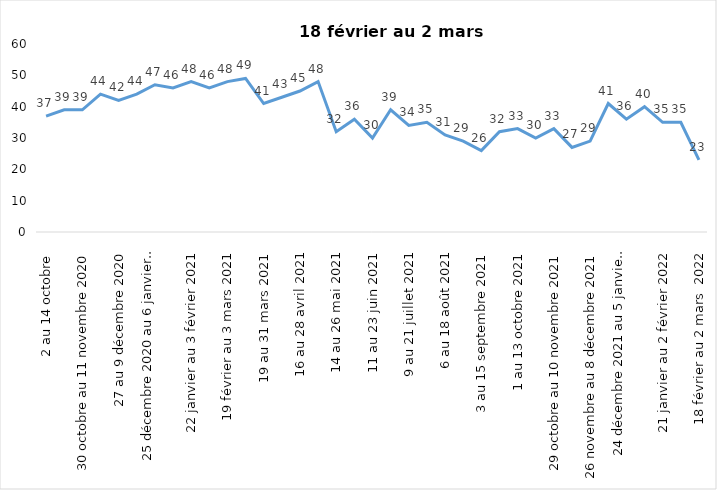
| Category | Toujours aux trois mesures |
|---|---|
| 2 au 14 octobre  | 37 |
| 16 au 28 octobre 2020 | 39 |
| 30 octobre au 11 novembre 2020 | 39 |
| 13 au 25 novembre 2020 | 44 |
| 27 au 9 décembre 2020 | 42 |
| 11 au 25 décembre 2020 | 44 |
| 25 décembre 2020 au 6 janvier  2021 | 47 |
| 8 au 20 janvier 2021 | 46 |
| 22 janvier au 3 février 2021 | 48 |
| 5 au 17 février 2021 | 46 |
| 19 février au 3 mars 2021 | 48 |
| 5 au 17 mars 2021 | 49 |
| 19 au 31 mars 2021 | 41 |
| 2 au 14 avril 2021 | 43 |
| 16 au 28 avril 2021 | 45 |
| 30 avril au 12 mai 2021 | 48 |
| 14 au 26 mai 2021 | 32 |
| 28 mai au 9 juin 2021 | 36 |
| 11 au 23 juin 2021 | 30 |
| 25 juin au 7 juillet 2021 | 39 |
| 9 au 21 juillet 2021 | 34 |
| 23 au 4 août 2021 | 35 |
| 6 au 18 août 2021 | 31 |
| 20 août au 1er septembre 2021 | 29 |
| 3 au 15 septembre 2021 | 26 |
| 17 au 29 septembre 2021 | 32 |
| 1 au 13 octobre 2021 | 33 |
| 15 au 27 octobre 2021 | 30 |
| 29 octobre au 10 novembre 2021 | 33 |
| 12 au 24 novembre 2021 | 27 |
| 26 novembre au 8 décembre 2021 | 29 |
| 10 au 22 décembre 2021 | 41 |
| 24 décembre 2021 au 5 janvier 2022 | 36 |
| 7 au 19 janvier 2022 | 40 |
| 21 janvier au 2 février 2022 | 35 |
| 4 au 16 février 2022 | 35 |
| 18 février au 2 mars  2022 | 23 |